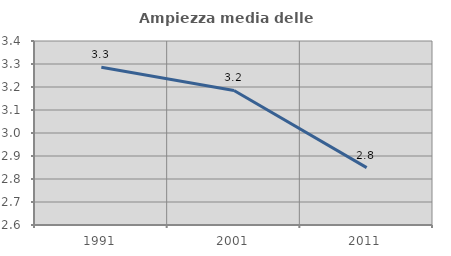
| Category | Ampiezza media delle famiglie |
|---|---|
| 1991.0 | 3.286 |
| 2001.0 | 3.185 |
| 2011.0 | 2.849 |